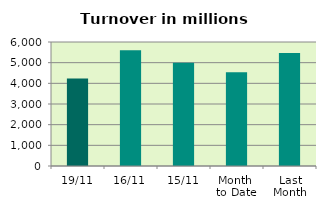
| Category | Series 0 |
|---|---|
| 19/11 | 4231.853 |
| 16/11 | 5602.856 |
| 15/11 | 4998.263 |
| Month 
to Date | 4539.349 |
| Last
Month | 5472.473 |